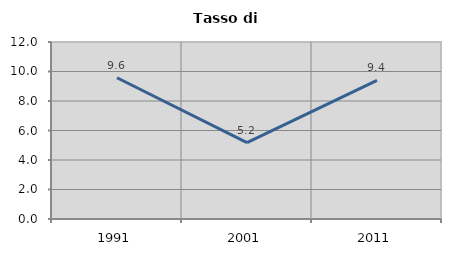
| Category | Tasso di disoccupazione   |
|---|---|
| 1991.0 | 9.576 |
| 2001.0 | 5.178 |
| 2011.0 | 9.401 |